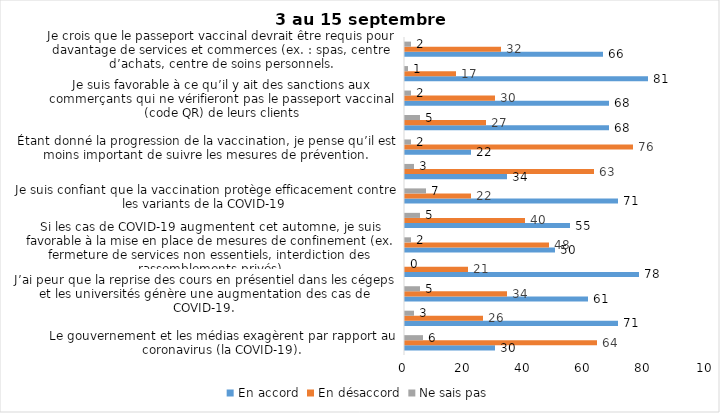
| Category | En accord | En désaccord | Ne sais pas |
|---|---|---|---|
| Le gouvernement et les médias exagèrent par rapport au coronavirus (la COVID-19). | 30 | 64 | 6 |
| J’ai peur que le système de santé soit débordé par les cas de COVID-19 suite au "déconfinement" | 71 | 26 | 3 |
| J’ai peur que la reprise des cours en présentiel dans les cégeps et les universités génère une augmentation des cas de COVID-19. | 61 | 34 | 5 |
| Je suis favorable au passeport vaccinal qui permettrait l'accès à certains lieux ou activités aux personnes vaccinées. | 78 | 21 | 0 |
| Si les cas de COVID-19 augmentent cet automne, je suis favorable à la mise en place de mesures de confinement (ex. fermeture de services non essentiels, interdiction des rassemblements privés) | 50 | 48 | 2 |
| Je suis inquiet de contracter le variant Delta de la Covid-19 | 55 | 40 | 5 |
| Je suis confiant que la vaccination protège efficacement contre les variants de la COVID-19 | 71 | 22 | 7 |
| Je suis favorable à ce que le port du masque ne soit plus obligatoire au Québec. | 34 | 63 | 3 |
| Étant donné la progression de la vaccination, je pense qu’il est moins important de suivre les mesures de prévention. | 22 | 76 | 2 |
| J'ai peur que la reprise des cours en présentiel dans les écoles primaires et secondaires génère une augmentation des cas de COVID-19 | 68 | 27 | 5 |
| Je suis favorable à ce qu’il y ait des sanctions aux commerçants qui ne vérifieront pas le passeport vaccinal (code QR) de leurs clients | 68 | 30 | 2 |
| Je suis favorable à ce qu’il y ait des sanctions aux gens qui tenteront de frauder leur passeport vaccinal par des amendes ou des accusations criminelles. | 81 | 17 | 1 |
| Je crois que le passeport vaccinal devrait être requis pour davantage de services et commerces (ex. : spas, centre d’achats, centre de soins personnels. | 66 | 32 | 2 |